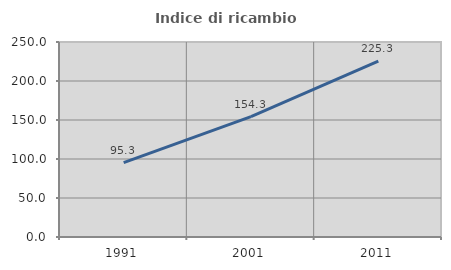
| Category | Indice di ricambio occupazionale  |
|---|---|
| 1991.0 | 95.294 |
| 2001.0 | 154.268 |
| 2011.0 | 225.342 |